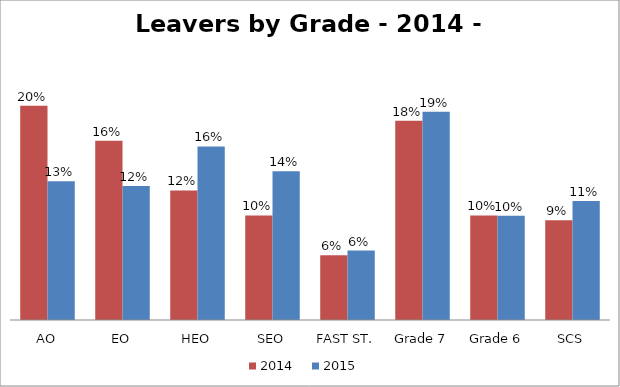
| Category | 2014
 | 2015
 |
|---|---|---|
| AO | 0.195 | 0.127 |
| EO | 0.164 | 0.122 |
| HEO | 0.118 | 0.158 |
| SEO | 0.095 | 0.136 |
| FAST ST. | 0.059 | 0.063 |
| Grade 7 | 0.182 | 0.19 |
| Grade 6 | 0.095 | 0.095 |
| SCS | 0.091 | 0.109 |